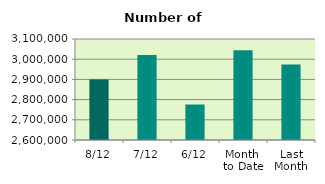
| Category | Series 0 |
|---|---|
| 8/12 | 2899738 |
| 7/12 | 3020788 |
| 6/12 | 2775694 |
| Month 
to Date | 3043953.667 |
| Last
Month | 2974168.364 |